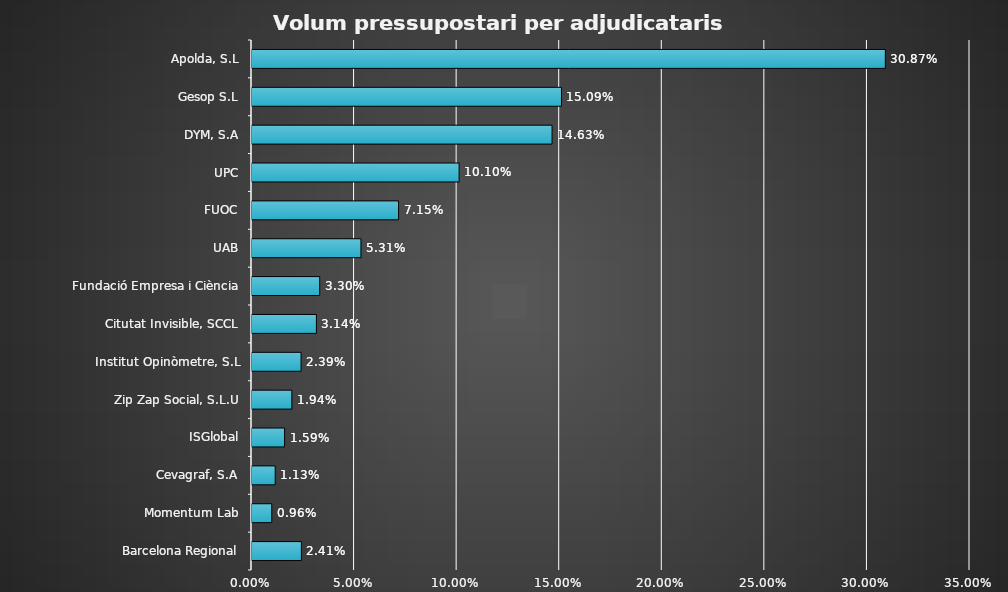
| Category | Series 0 |
|---|---|
| Barcelona Regional | 0.024 |
| Momentum Lab | 0.01 |
| Cevagraf, S.A | 0.011 |
| ISGlobal | 0.016 |
| Zip Zap Social, S.L.U | 0.019 |
| Institut Opinòmetre, S.L | 0.024 |
| Citutat Invisible, SCCL | 0.031 |
| Fundació Empresa i Ciència | 0.033 |
| UAB | 0.053 |
| FUOC | 0.071 |
| UPC | 0.101 |
| DYM, S.A | 0.146 |
| Gesop S.L | 0.151 |
| Apolda, S.L | 0.309 |